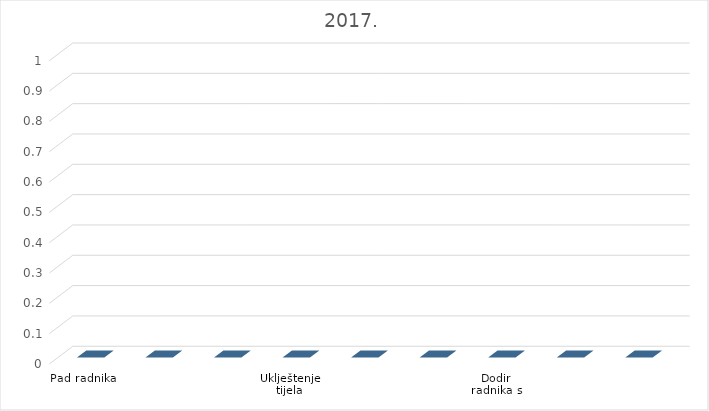
| Category | 2017. |
|---|---|
| Pad radnika | 0 |
| Pad predmeta na radnika | 0 |
| Sudar radnika s predmetima | 0 |
| Uklještenje tijela radnika | 0 |
| Prekomjerna tjelesna naprezanja ili pogrešni pokreti radnika | 0 |
| Izloženost radnika | 0 |
| Dodir radnika s predmetom pod naponom električne struje | 0 |
| Utjecaj štetnih materija ili radijacija na radnika | 0 |
| Ostali načini nastanka povreda radnika na radu | 0 |